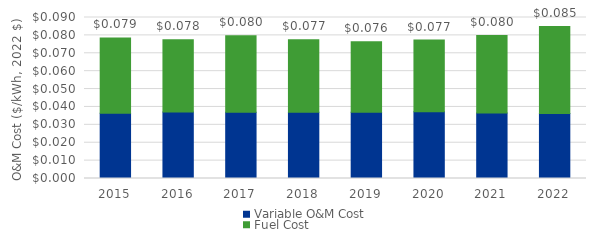
| Category | Variable O&M Cost | Fuel Cost |
|---|---|---|
| 2015.0 | 0.037 | 0.042 |
| 2016.0 | 0.037 | 0.04 |
| 2017.0 | 0.037 | 0.043 |
| 2018.0 | 0.037 | 0.04 |
| 2019.0 | 0.037 | 0.039 |
| 2020.0 | 0.037 | 0.04 |
| 2021.0 | 0.037 | 0.043 |
| 2022.0 | 0.036 | 0.049 |